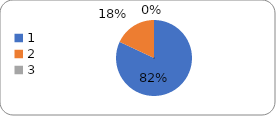
| Category | Series 0 |
|---|---|
| 0 | 91 |
| 1 | 20 |
| 2 | 0 |